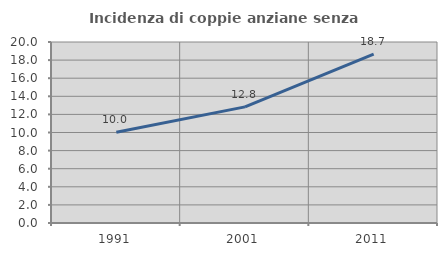
| Category | Incidenza di coppie anziane senza figli  |
|---|---|
| 1991.0 | 10.037 |
| 2001.0 | 12.832 |
| 2011.0 | 18.651 |